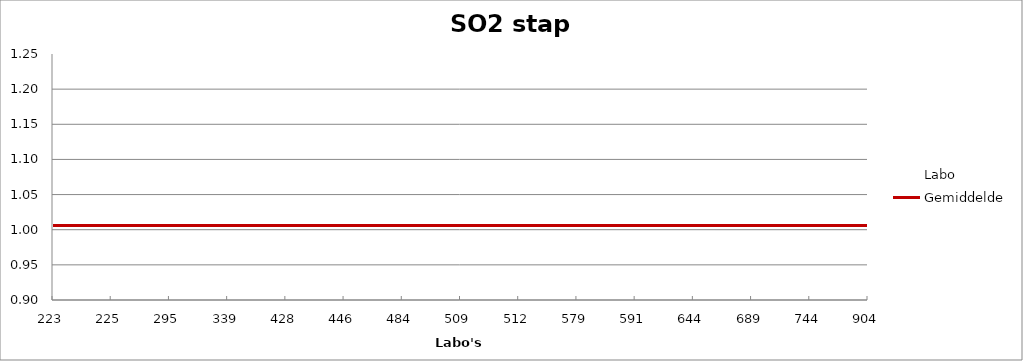
| Category | Labo | Gemiddelde |
|---|---|---|
| 223.0 | 1.06 | 1.006 |
| 225.0 | 0.988 | 1.006 |
| 295.0 | 1.005 | 1.006 |
| 339.0 | 0.957 | 1.006 |
| 428.0 | 1.243 | 1.006 |
| 446.0 | 1.08 | 1.006 |
| 484.0 | 1.11 | 1.006 |
| 509.0 | 0.994 | 1.006 |
| 512.0 | 0.979 | 1.006 |
| 579.0 | 0.979 | 1.006 |
| 591.0 | 0.994 | 1.006 |
| 644.0 | 0.962 | 1.006 |
| 689.0 | 0.966 | 1.006 |
| 744.0 | 1.06 | 1.006 |
| 904.0 | 0.955 | 1.006 |